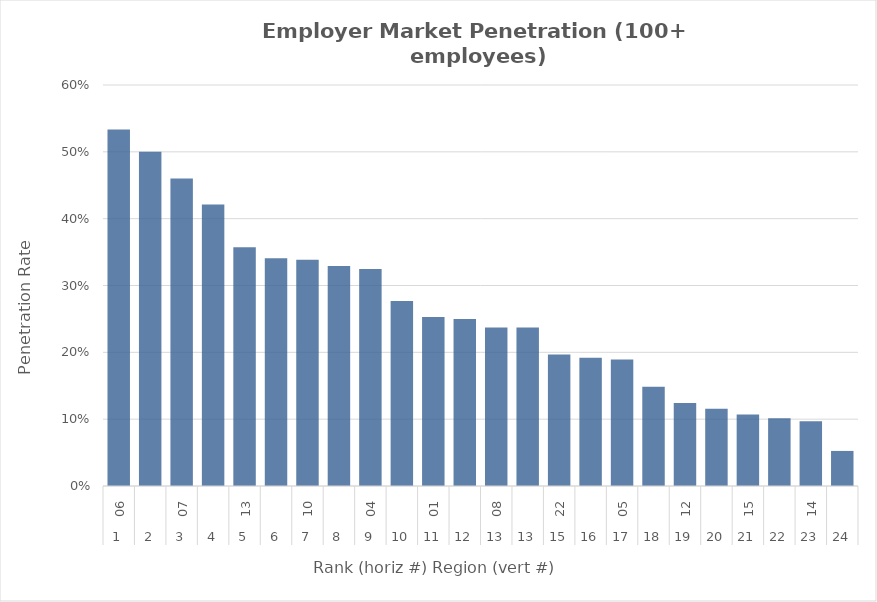
| Category | Rate |
|---|---|
| 0 | 0.533 |
| 1 | 0.5 |
| 2 | 0.46 |
| 3 | 0.421 |
| 4 | 0.357 |
| 5 | 0.341 |
| 6 | 0.339 |
| 7 | 0.329 |
| 8 | 0.325 |
| 9 | 0.277 |
| 10 | 0.253 |
| 11 | 0.25 |
| 12 | 0.237 |
| 13 | 0.237 |
| 14 | 0.197 |
| 15 | 0.192 |
| 16 | 0.189 |
| 17 | 0.149 |
| 18 | 0.124 |
| 19 | 0.116 |
| 20 | 0.107 |
| 21 | 0.101 |
| 22 | 0.097 |
| 23 | 0.052 |